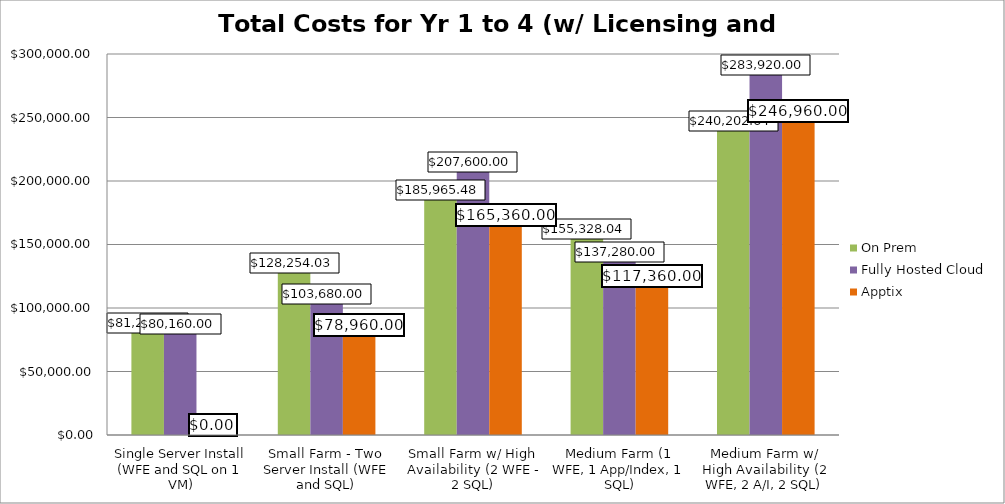
| Category | On Prem | Fully Hosted Cloud | Apptix |
|---|---|---|---|
| Single Server Install (WFE and SQL on 1 VM) | 81299.99 | 80160 | 0 |
| Small Farm - Two Server Install (WFE and SQL) | 128254.029 | 103680 | 78960 |
| Small Farm w/ High Availability (2 WFE - 2 SQL) | 185965.482 | 207600 | 165360 |
| Medium Farm (1 WFE, 1 App/Index, 1 SQL) | 155328.041 | 137280 | 117360 |
| Medium Farm w/ High Availability (2 WFE, 2 A/I, 2 SQL) | 240202.64 | 283920 | 246960 |